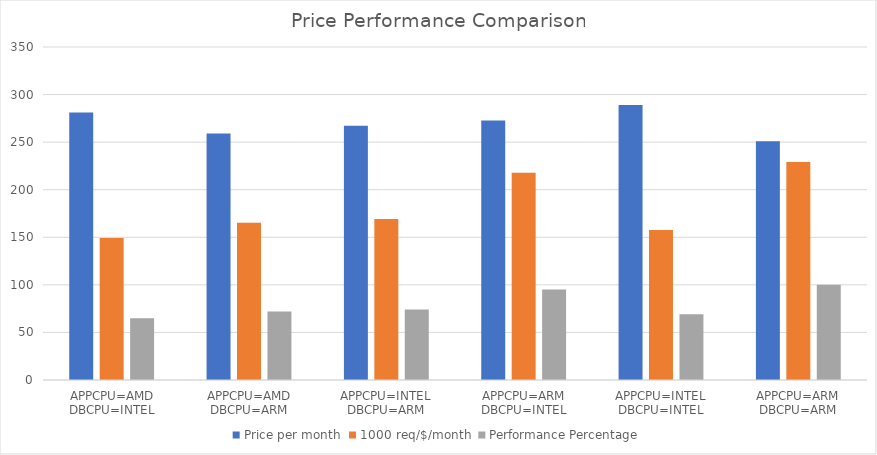
| Category | Price per month | 1000 req/$/month | Performance Percentage |
|---|---|---|---|
| APPCPU=AMD DBCPU=INTEL | 281.05 | 149.18 | 65 |
| APPCPU=AMD DBCPU=ARM | 259.15 | 165.19 | 72 |
| APPCPU=INTEL DBCPU=ARM | 267.18 | 169.16 | 74 |
| APPCPU=ARM DBCPU=INTEL | 272.87 | 217.83 | 95 |
| APPCPU=INTEL DBCPU=INTEL | 289.08 | 157.54 | 69 |
| APPCPU=ARM DBCPU=ARM | 250.97 | 229.08 | 100 |